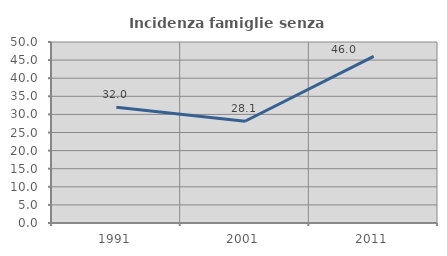
| Category | Incidenza famiglie senza nuclei |
|---|---|
| 1991.0 | 31.986 |
| 2001.0 | 28.102 |
| 2011.0 | 46.023 |